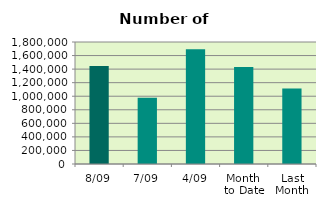
| Category | Series 0 |
|---|---|
| 8/09 | 1445528 |
| 7/09 | 977394 |
| 4/09 | 1691190 |
| Month 
to Date | 1430276.667 |
| Last
Month | 1113186.286 |